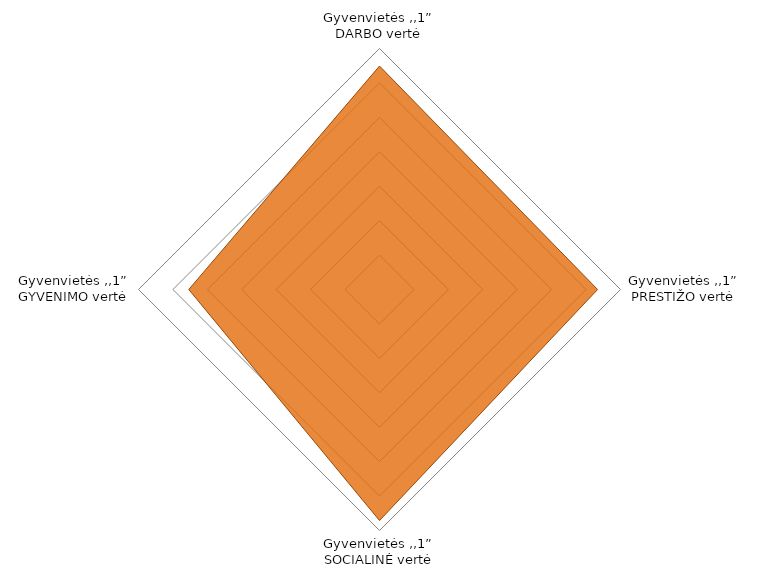
| Category | Series 0 |
|---|---|
| Gyvenvietės ,,1” DARBO vertė | 129800 |
| Gyvenvietės ,,1” PRESTIŽO vertė | 126700 |
| Gyvenvietės ,,1” SOCIALINĖ vertė | 134200 |
| Gyvenvietės ,,1” GYVENIMO vertė | 110800 |